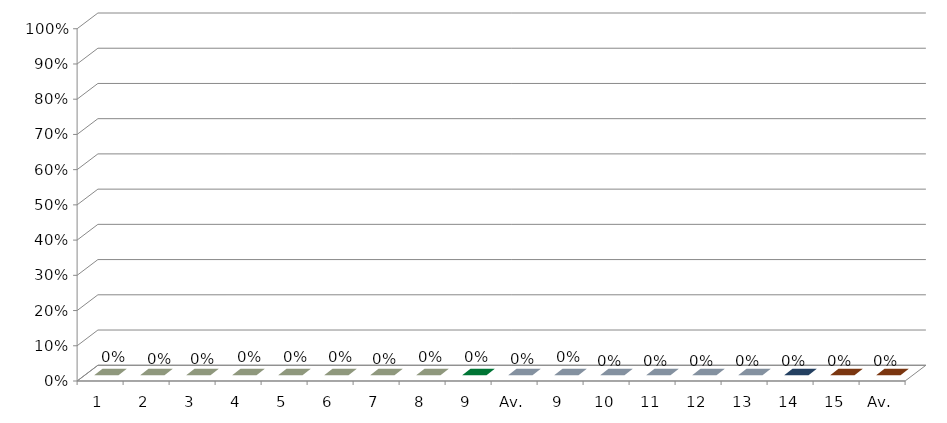
| Category | Series 3 |
|---|---|
| 1 | 0 |
| 2 | 0 |
| 3 | 0 |
| 4 | 0 |
| 5 | 0 |
| 6 | 0 |
| 7 | 0 |
| 8 | 0 |
| 9 | 0 |
| Av. | 0 |
| 9 | 0 |
| 10 | 0 |
| 11 | 0 |
| 12 | 0 |
| 13 | 0 |
| 14 | 0 |
| 15 | 0 |
| Av. | 0 |